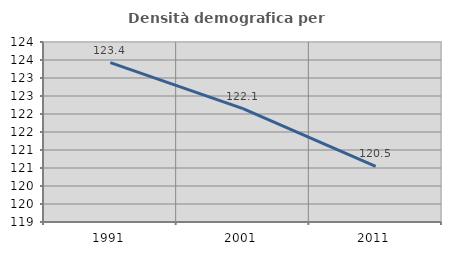
| Category | Densità demografica |
|---|---|
| 1991.0 | 123.429 |
| 2001.0 | 122.148 |
| 2011.0 | 120.543 |